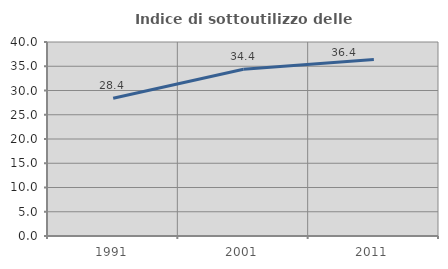
| Category | Indice di sottoutilizzo delle abitazioni  |
|---|---|
| 1991.0 | 28.398 |
| 2001.0 | 34.399 |
| 2011.0 | 36.383 |